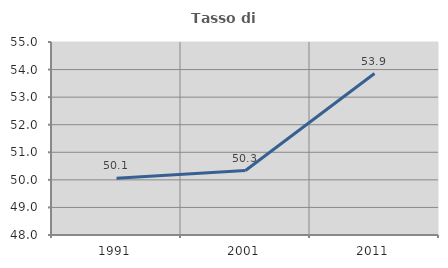
| Category | Tasso di occupazione   |
|---|---|
| 1991.0 | 50.055 |
| 2001.0 | 50.338 |
| 2011.0 | 53.857 |